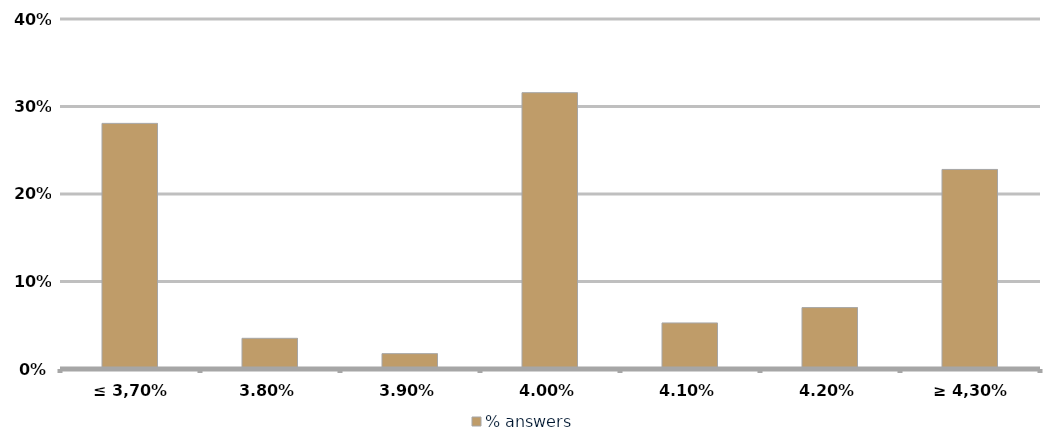
| Category | % answers |
|---|---|
| ≤ 3,70% | 0.281 |
| 3,80% | 0.035 |
| 3,90% | 0.018 |
| 4,00% | 0.316 |
| 4,10% | 0.053 |
| 4,20% | 0.07 |
| ≥ 4,30% | 0.228 |